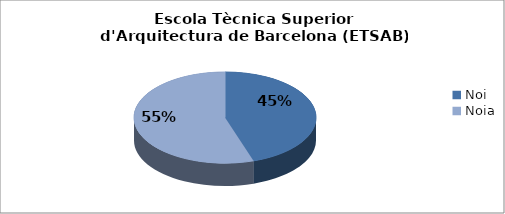
| Category | Escola Tècnica Superior d'Arquitectura de Barcelona (ETSAB) - Gènere |
|---|---|
| Noi | 0.449 |
| Noia | 0.551 |